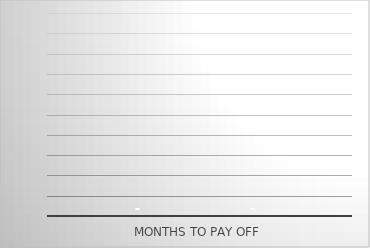
| Category | Months to Pay Off | Months to Pay Off (Fixed) |
|---|---|---|
| 0 | 0 | 0 |